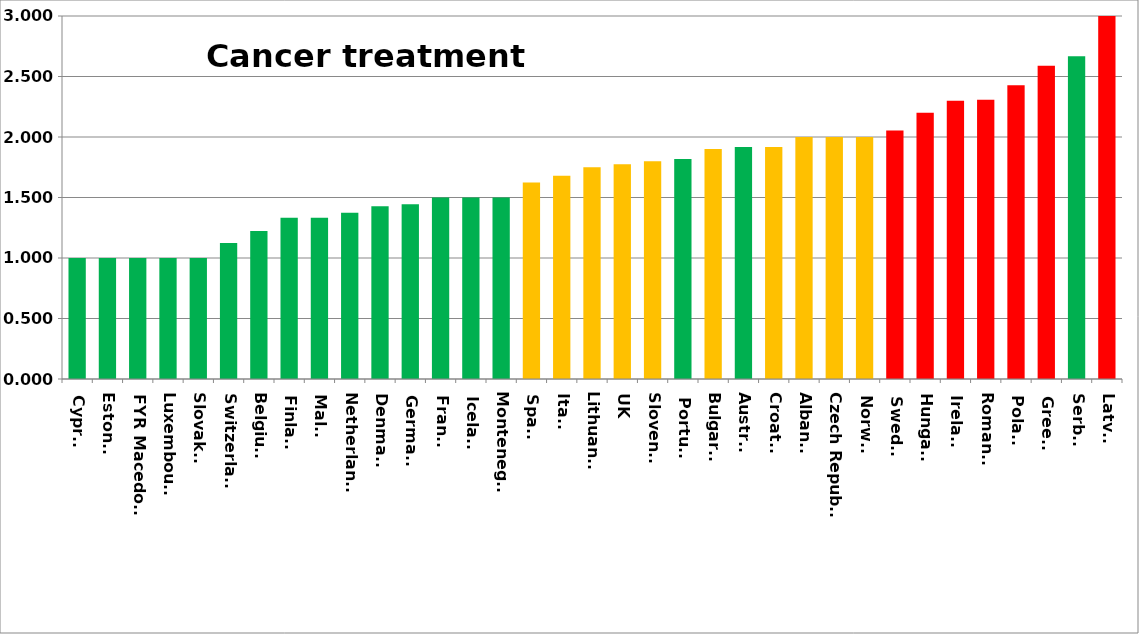
| Category | Series 0 |
|---|---|
| Cyprus | 1 |
| Estonia | 1 |
| FYR Macedonia | 1 |
| Luxembourg | 1 |
| Slovakia | 1 |
| Switzerland | 1.125 |
| Belgium | 1.222 |
| Finland | 1.333 |
| Malta | 1.333 |
| Netherlands | 1.375 |
| Denmark | 1.429 |
| Germany | 1.444 |
| France | 1.5 |
| Iceland | 1.5 |
| Montenegro | 1.5 |
| Spain | 1.623 |
| Italy | 1.679 |
| Lithuania | 1.75 |
| UK | 1.776 |
| Slovenia | 1.8 |
| Portugal | 1.818 |
| Bulgaria | 1.9 |
| Austria | 1.917 |
| Croatia | 1.917 |
| Albania | 2 |
| Czech Republic | 2 |
| Norway | 2 |
| Sweden | 2.054 |
| Hungary | 2.2 |
| Ireland | 2.3 |
| Romania | 2.308 |
| Poland | 2.429 |
| Greece | 2.588 |
| Serbia | 2.667 |
| Latvia | 3 |